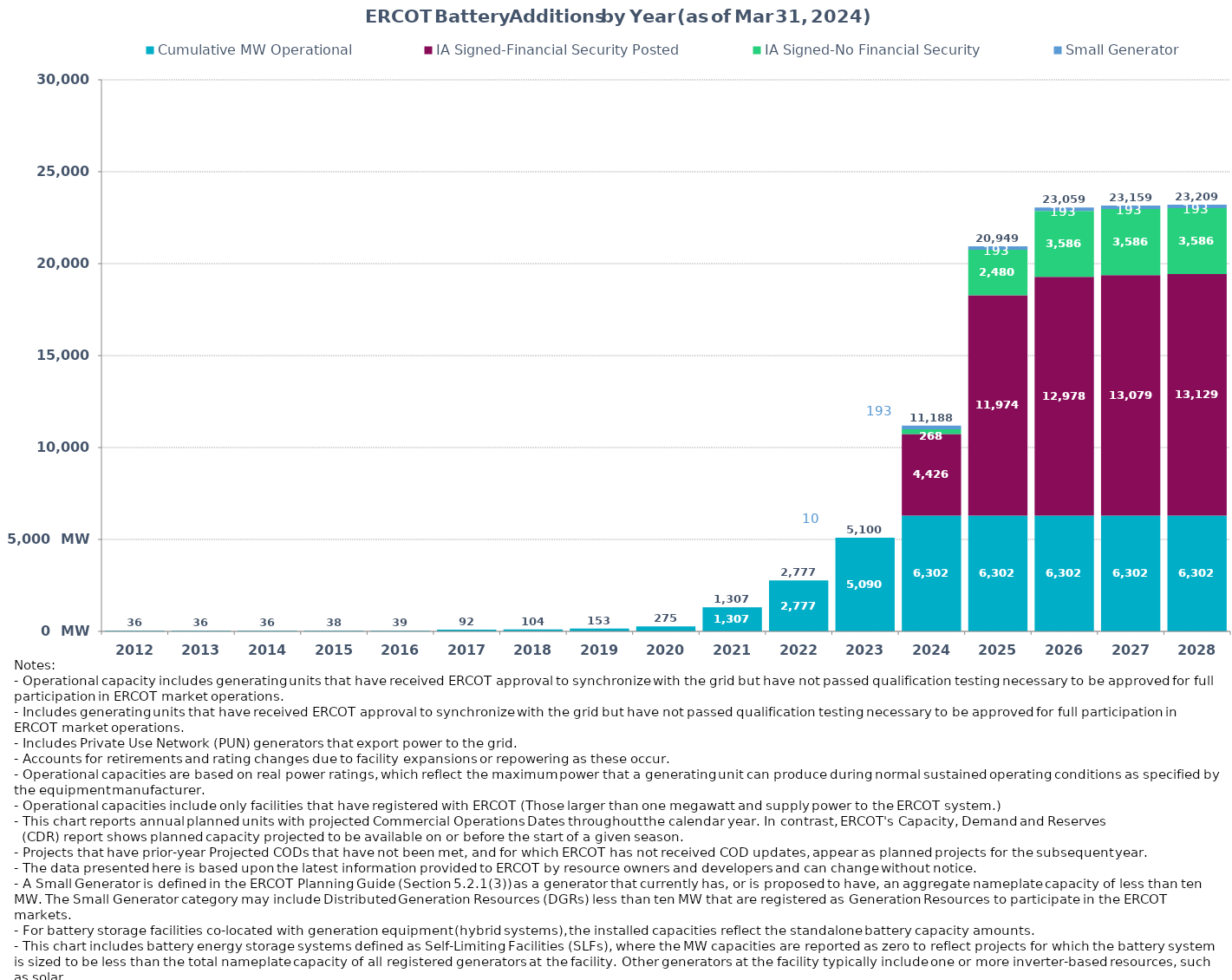
| Category | Cumulative MW Operational | IA Signed-Financial Security Posted  | IA Signed-No Financial Security  | Small Generator | Cumulative Installed and Planned |
|---|---|---|---|---|---|
| 2012.0 | 36 | 0 | 0 | 0 | 36 |
| 2013.0 | 36 | 0 | 0 | 0 | 36 |
| 2014.0 | 36 | 0 | 0 | 0 | 36 |
| 2015.0 | 38 | 0 | 0 | 0 | 38 |
| 2016.0 | 39 | 0 | 0 | 0 | 39 |
| 2017.0 | 92.3 | 0 | 0 | 0 | 92.3 |
| 2018.0 | 103.7 | 0 | 0 | 0 | 103.7 |
| 2019.0 | 153.3 | 0 | 0 | 0 | 153.3 |
| 2020.0 | 275.4 | 0 | 0 | 0 | 275.4 |
| 2021.0 | 1306.53 | 0 | 0 | 0 | 1306.53 |
| 2022.0 | 2776.96 | 0 | 0 | 0 | 2776.96 |
| 2023.0 | 5090.12 | 0 | 0 | 9.95 | 5100.07 |
| 2024.0 | 6301.84 | 4425.92 | 267.51 | 192.94 | 11188.21 |
| 2025.0 | 6301.84 | 11974.18 | 2480.05 | 192.94 | 20949.01 |
| 2026.0 | 6301.84 | 12978.08 | 3585.82 | 192.94 | 23058.68 |
| 2027.0 | 6301.84 | 13078.85 | 3585.82 | 192.94 | 23159.45 |
| 2028.0 | 6301.84 | 13128.85 | 3585.82 | 192.94 | 23209.45 |